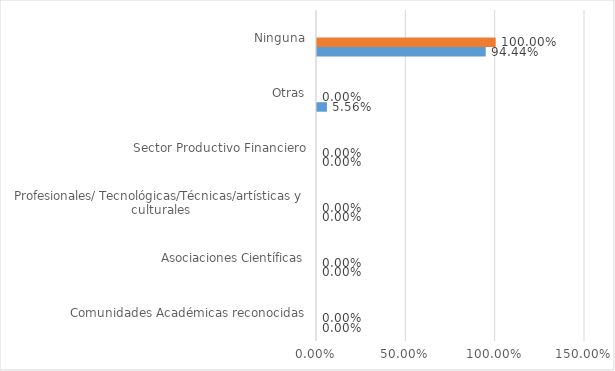
| Category | Series 0 | Series 1 | Series 2 | Series 3 |
|---|---|---|---|---|
| Comunidades Académicas reconocidas | 0 | 0 | 0 | 0 |
| Asociaciones Científicas | 0 | 0 | 0 | 0 |
| Profesionales/ Tecnológicas/Técnicas/artísticas y culturales | 0 | 0 | 0 | 0 |
| Sector Productivo Financiero | 0 | 0 | 0 | 0 |
| Otras | 0.056 | 0 | 0 | 0 |
| Ninguna | 0.944 | 1 | 0 | 0 |